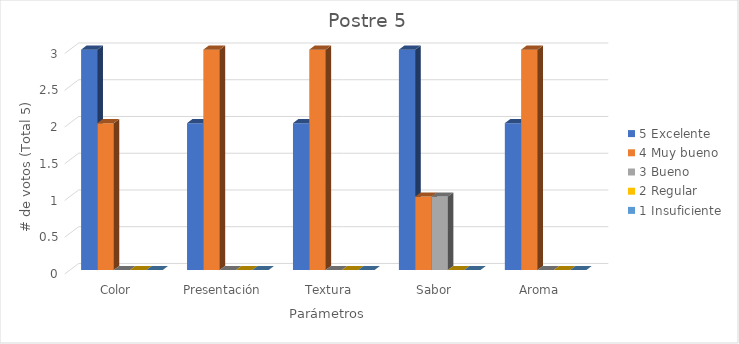
| Category | 5 | 4 | 3 | 2 | 1 |
|---|---|---|---|---|---|
| Color | 3 | 2 | 0 | 0 | 0 |
| Presentación | 2 | 3 | 0 | 0 | 0 |
| Textura | 2 | 3 | 0 | 0 | 0 |
| Sabor | 3 | 1 | 1 | 0 | 0 |
| Aroma | 2 | 3 | 0 | 0 | 0 |